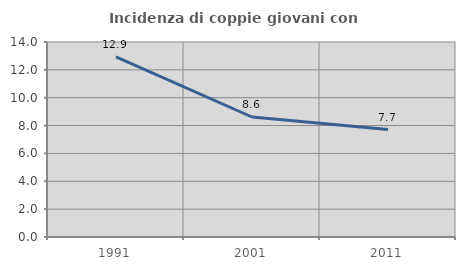
| Category | Incidenza di coppie giovani con figli |
|---|---|
| 1991.0 | 12.934 |
| 2001.0 | 8.615 |
| 2011.0 | 7.715 |